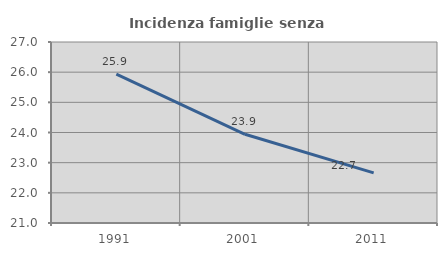
| Category | Incidenza famiglie senza nuclei |
|---|---|
| 1991.0 | 25.933 |
| 2001.0 | 23.941 |
| 2011.0 | 22.663 |